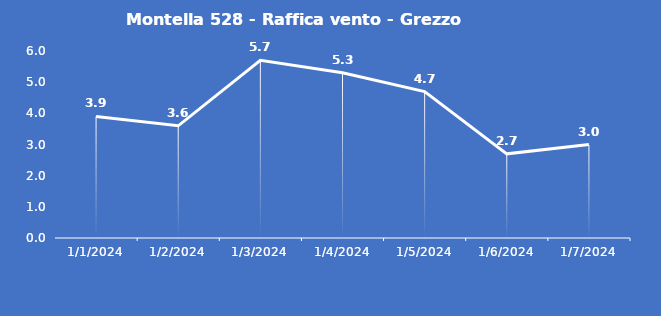
| Category | Montella 528 - Raffica vento - Grezzo (m/s) |
|---|---|
| 1/1/24 | 3.9 |
| 1/2/24 | 3.6 |
| 1/3/24 | 5.7 |
| 1/4/24 | 5.3 |
| 1/5/24 | 4.7 |
| 1/6/24 | 2.7 |
| 1/7/24 | 3 |